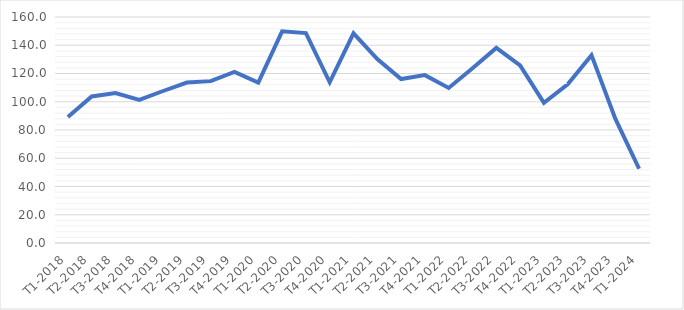
| Category | Series 0 |
|---|---|
| T1-2018 | 89.133 |
| T2-2018 | 103.723 |
| T3-2018 | 106.153 |
| T4-2018 | 101.243 |
| T1-2019 | 107.611 |
| T2-2019 | 113.622 |
| T3-2019 | 114.596 |
| T4-2019 | 121.131 |
| T1-2020 | 113.521 |
| T2-2020 | 149.875 |
| T3-2020 | 148.645 |
| T4-2020 | 113.801 |
| T1-2021 | 148.424 |
| T2-2021 | 130.21 |
| T3-2021 | 116.061 |
| T4-2021 | 118.843 |
| T1-2022 | 109.791 |
| T2-2022 | 123.753 |
| T3-2022 | 138.115 |
| T4-2022 | 125.7 |
| T1-2023 | 99.285 |
| T2-2023 | 112.343 |
| T3-2023 | 132.978 |
| T4-2023 | 88.067 |
| T1-2024 | 52.554 |